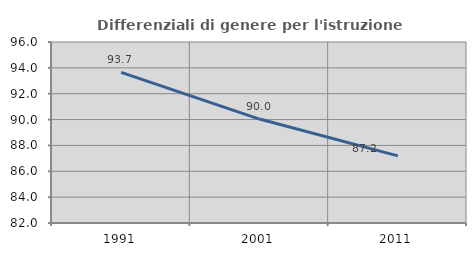
| Category | Differenziali di genere per l'istruzione superiore |
|---|---|
| 1991.0 | 93.655 |
| 2001.0 | 90.039 |
| 2011.0 | 87.19 |